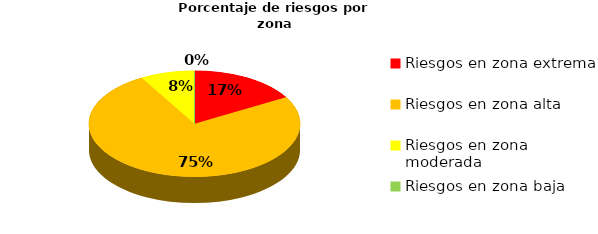
| Category | Series 0 | Series 1 |
|---|---|---|
| Riesgos en zona extrema | 2 | 0.167 |
| Riesgos en zona alta | 9 | 0.75 |
| Riesgos en zona moderada | 1 | 0.083 |
| Riesgos en zona baja | 0 | 0 |